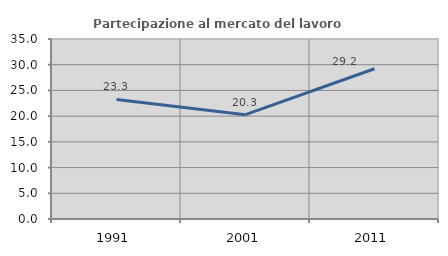
| Category | Partecipazione al mercato del lavoro  femminile |
|---|---|
| 1991.0 | 23.256 |
| 2001.0 | 20.281 |
| 2011.0 | 29.217 |